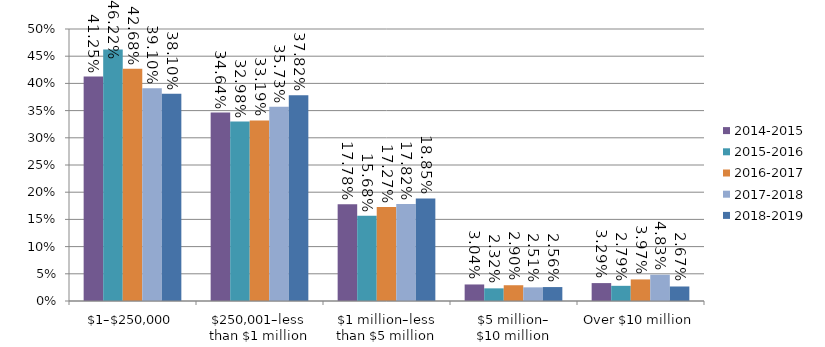
| Category | 2014-2015 | 2015-2016 | 2016-2017 | 2017-2018 | 2018-2019 |
|---|---|---|---|---|---|
| $1–$250,000 | 0.412 | 0.462 | 0.427 | 0.391 | 0.381 |
| $250,001–less than $1 million | 0.346 | 0.33 | 0.332 | 0.357 | 0.378 |
| $1 million–less than $5 million | 0.178 | 0.157 | 0.173 | 0.178 | 0.188 |
| $5 million–
$10 million | 0.03 | 0.023 | 0.029 | 0.025 | 0.026 |
| Over $10 million | 0.033 | 0.028 | 0.04 | 0.048 | 0.027 |